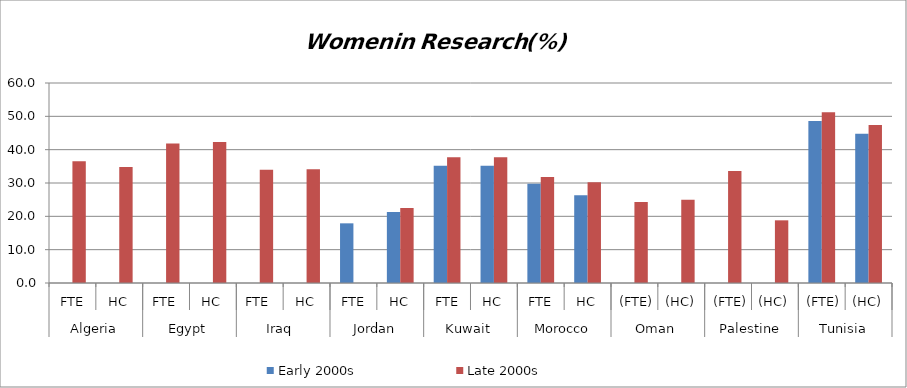
| Category | Early 2000s | Late 2000s |
|---|---|---|
| 0 | 0 | 36.5 |
| 1 | 0 | 34.8 |
| 2 | 0 | 41.87 |
| 3 | 0 | 42.32 |
| 4 | 0 | 33.94 |
| 5 | 0 | 34.16 |
| 6 | 17.9 | 0 |
| 7 | 21.3 | 22.5 |
| 8 | 35.2 | 37.71 |
| 9 | 35.2 | 37.71 |
| 10 | 29.8 | 31.78 |
| 11 | 26.3 | 30.19 |
| 12 | 0 | 24.29 |
| 13 | 0 | 24.94 |
| 14 | 0 | 33.6 |
| 15 | 0 | 18.8 |
| 16 | 48.6 | 51.2 |
| 17 | 44.8 | 47.4 |